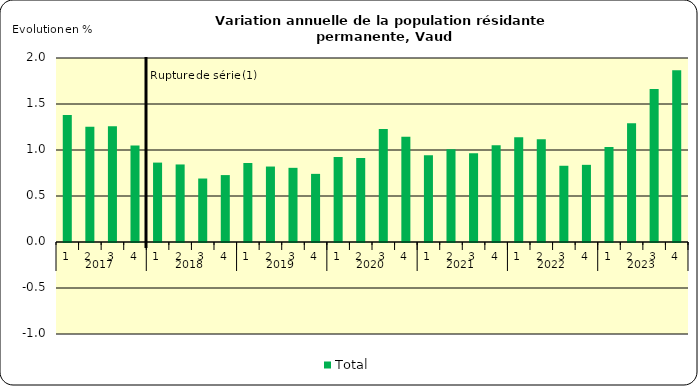
| Category | Total |
|---|---|
| 0 | 1.379 |
| 1 | 1.252 |
| 2 | 1.259 |
| 3 | 1.049 |
| 4 | 0.863 |
| 5 | 0.843 |
| 6 | 0.69 |
| 7 | 0.727 |
| 8 | 0.858 |
| 9 | 0.82 |
| 10 | 0.806 |
| 11 | 0.741 |
| 12 | 0.924 |
| 13 | 0.914 |
| 14 | 1.227 |
| 15 | 1.143 |
| 16 | 0.942 |
| 17 | 1.009 |
| 18 | 0.963 |
| 19 | 1.052 |
| 20 | 1.139 |
| 21 | 1.116 |
| 22 | 0.829 |
| 23 | 0.839 |
| 24 | 1.033 |
| 25 | 1.292 |
| 26 | 1.664 |
| 27 | 1.867 |